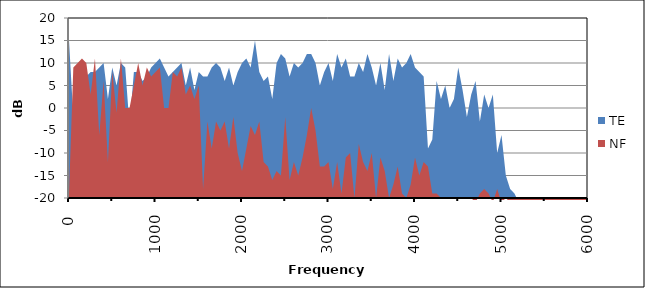
| Category | TE | NF |
|---|---|---|
| 0.0 | 15 | -19 |
| nan | -2 | 9 |
| nan | 4 | 10 |
| nan | 5 | 11 |
| nan | 7 | 10 |
| nan | 8 | 3 |
| nan | 8 | 11 |
| nan | 9 | -6 |
| nan | 10 | 6 |
| nan | 2 | -12 |
| nan | 9 | 8 |
| nan | 5 | -1 |
| nan | 10 | 11 |
| nan | 9 | 0 |
| nan | -4 | 0 |
| nan | 8 | 5 |
| nan | 8 | 10 |
| nan | 6 | 5 |
| nan | 7 | 9 |
| nan | 9 | 7 |
| 1000.0 | 10 | 8 |
| nan | 11 | 9 |
| nan | 9 | 0 |
| nan | 7 | 0 |
| nan | 8 | 8 |
| nan | 9 | 7 |
| nan | 10 | 9 |
| nan | 5 | 3 |
| nan | 9 | 5 |
| nan | 4 | 2 |
| nan | 8 | 5 |
| nan | 7 | -18 |
| nan | 7 | -3 |
| nan | 9 | -9 |
| nan | 10 | -3 |
| nan | 9 | -5 |
| nan | 6 | -3 |
| nan | 9 | -9 |
| nan | 5 | -2 |
| nan | 8 | -10 |
| 2000.0 | 10 | -14 |
| nan | 11 | -9 |
| nan | 9 | -4 |
| nan | 15 | -6 |
| nan | 8 | -3 |
| nan | 6 | -12 |
| nan | 7 | -13 |
| nan | 2 | -16 |
| nan | 10 | -14 |
| nan | 12 | -15 |
| nan | 11 | -2 |
| nan | 7 | -16 |
| nan | 10 | -12 |
| nan | 9 | -15 |
| nan | 10 | -11 |
| nan | 12 | -6 |
| nan | 12 | 0 |
| nan | 10 | -5 |
| nan | 5 | -13 |
| nan | 8 | -13 |
| 3000.0 | 10 | -12 |
| nan | 6 | -18 |
| nan | 12 | -12 |
| nan | 9 | -19 |
| nan | 11 | -11 |
| nan | 7 | -10 |
| nan | 7 | -20 |
| nan | 10 | -8 |
| nan | 8 | -12 |
| nan | 12 | -14 |
| nan | 9 | -10 |
| nan | 5 | -20 |
| nan | 10 | -11 |
| nan | 4 | -14 |
| nan | 12 | -20 |
| nan | 6 | -17 |
| nan | 11 | -13 |
| nan | 9 | -19 |
| nan | 10 | -20 |
| nan | 12 | -17 |
| 4000.0 | 9 | -11 |
| nan | 8 | -15 |
| nan | 7 | -12 |
| nan | -9 | -13 |
| nan | -7 | -19 |
| nan | 6 | -19 |
| nan | 2 | -20 |
| nan | 5 | -20 |
| nan | 0 | -20 |
| nan | 2 | -20 |
| nan | 9 | -20 |
| nan | 4 | -20 |
| nan | -2 | -20 |
| nan | 3 | -20 |
| nan | 6 | -21 |
| nan | -3 | -19 |
| nan | 3 | -18 |
| nan | 0 | -19 |
| nan | 3 | -21 |
| nan | -10 | -18 |
| 5000.0 | -6 | -21 |
| nan | -15 | -20 |
| nan | -18 | -21 |
| nan | -19 | -24 |
| nan | -21 | -25 |
| nan | -21 | -25 |
| nan | -21 | -25 |
| nan | -21 | -25 |
| nan | -21 | -25 |
| nan | -21 | -25 |
| nan | -21 | -25 |
| nan | -20 | -24 |
| nan | -21 | -25 |
| nan | -20 | -23 |
| nan | -21 | -25 |
| nan | -21 | -24 |
| nan | -21 | -25 |
| nan | -21 | -25 |
| nan | -21 | -25 |
| nan | -21 | -25 |
| 6000.0 | -21 | -25 |